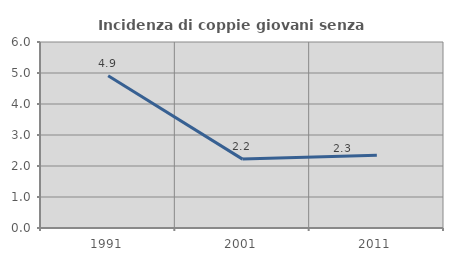
| Category | Incidenza di coppie giovani senza figli |
|---|---|
| 1991.0 | 4.912 |
| 2001.0 | 2.222 |
| 2011.0 | 2.344 |